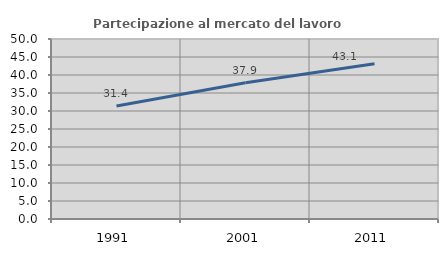
| Category | Partecipazione al mercato del lavoro  femminile |
|---|---|
| 1991.0 | 31.388 |
| 2001.0 | 37.853 |
| 2011.0 | 43.127 |